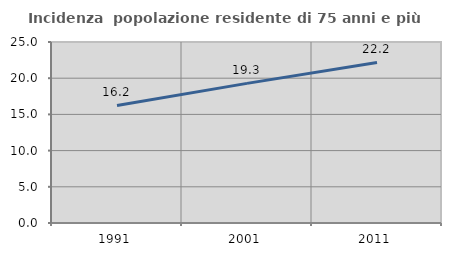
| Category | Incidenza  popolazione residente di 75 anni e più |
|---|---|
| 1991.0 | 16.237 |
| 2001.0 | 19.288 |
| 2011.0 | 22.17 |